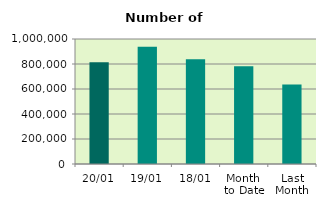
| Category | Series 0 |
|---|---|
| 20/01 | 813606 |
| 19/01 | 937366 |
| 18/01 | 837078 |
| Month 
to Date | 782622.143 |
| Last
Month | 635205.478 |